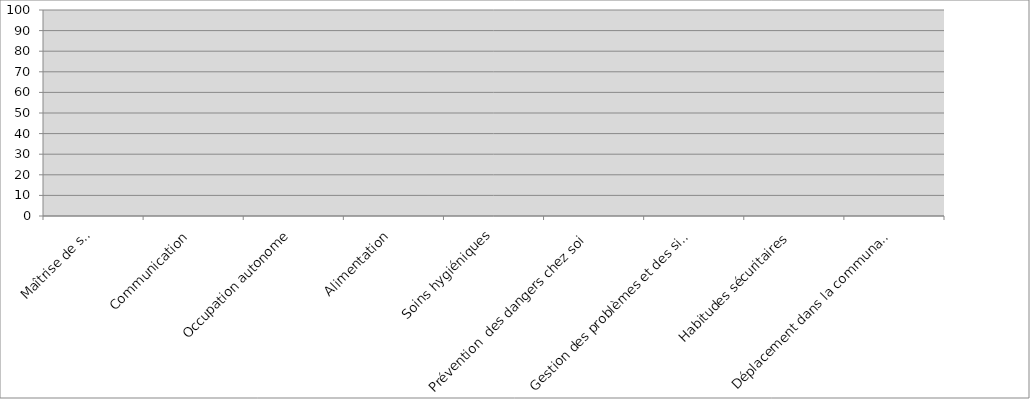
| Category | Series 1 |
|---|---|
| Maîtrise de soi | 0 |
| Communication | 0 |
| Occupation autonome | 0 |
| Alimentation | 0 |
| Soins hygiéniques | 0 |
| Prévention  des dangers chez soi | 0 |
| Gestion des problèmes et des situations  urgentes | 0 |
| Habitudes sécuritaires | 0 |
| Déplacement dans la communauté | 0 |